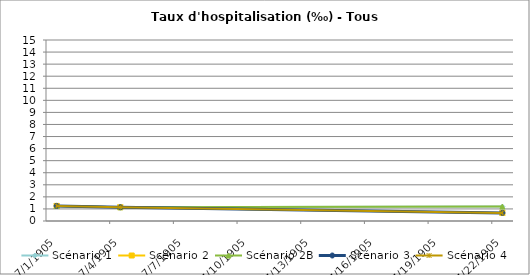
| Category | Scénario 1 | Scénario 2 | Scénario 2B | Scénario 3 | Scénario 4 |
|---|---|---|---|---|---|
| 2009.0 | 1.251 | 1.251 | 1.251 | 1.251 | 1.251 |
| 2012.0 | 1.141 | 1.141 | 1.141 | 1.141 | 1.141 |
| 2030.0 | 1.195 | 0.671 | 1.195 | 0.671 | 0.671 |